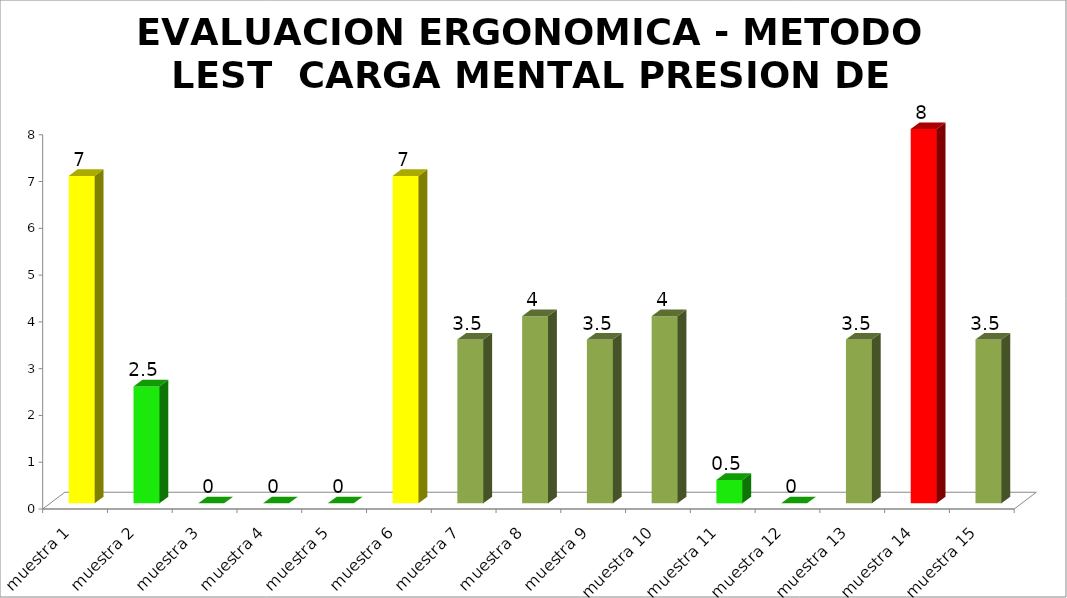
| Category | EVALUACION ERGONOMICA - METODO LEST  |
|---|---|
| muestra 1 | 7 |
| muestra 2 | 2.5 |
| muestra 3 | 0 |
| muestra 4 | 0 |
| muestra 5 | 0 |
| muestra 6 | 7 |
| muestra 7 | 3.5 |
| muestra 8 | 4 |
| muestra 9 | 3.5 |
| muestra 10 | 4 |
| muestra 11 | 0.5 |
| muestra 12 | 0 |
| muestra 13 | 3.5 |
| muestra 14 | 8 |
| muestra 15 | 3.5 |